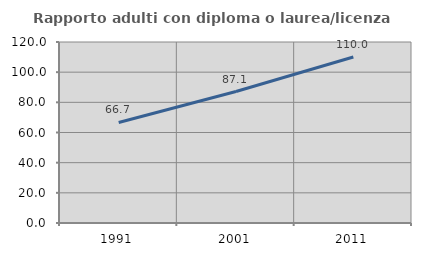
| Category | Rapporto adulti con diploma o laurea/licenza media  |
|---|---|
| 1991.0 | 66.667 |
| 2001.0 | 87.149 |
| 2011.0 | 110.035 |